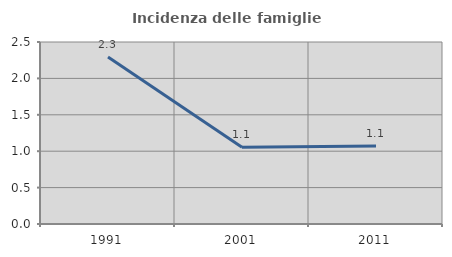
| Category | Incidenza delle famiglie numerose |
|---|---|
| 1991.0 | 2.293 |
| 2001.0 | 1.055 |
| 2011.0 | 1.07 |